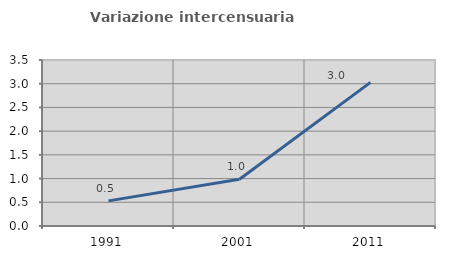
| Category | Variazione intercensuaria annua |
|---|---|
| 1991.0 | 0.53 |
| 2001.0 | 0.987 |
| 2011.0 | 3.029 |